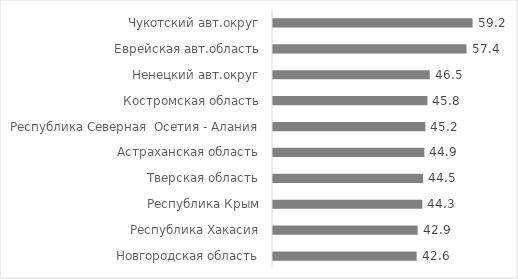
| Category | Series 0 |
|---|---|
| Чукотский авт.округ | 59.2 |
| Еврейская авт.область | 57.4 |
| Ненецкий авт.округ | 46.5 |
| Костромская область | 45.8 |
| Республика Северная  Осетия - Алания | 45.2 |
| Астраханская область | 44.9 |
| Тверская область | 44.5 |
| Республика Крым | 44.3 |
| Республика Хакасия | 42.9 |
| Новгородская область | 42.6 |